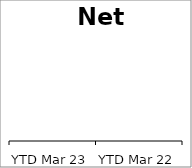
| Category | Net profit |
|---|---|
| YTD Mar 23 | 0 |
| YTD Mar 22 | 0 |